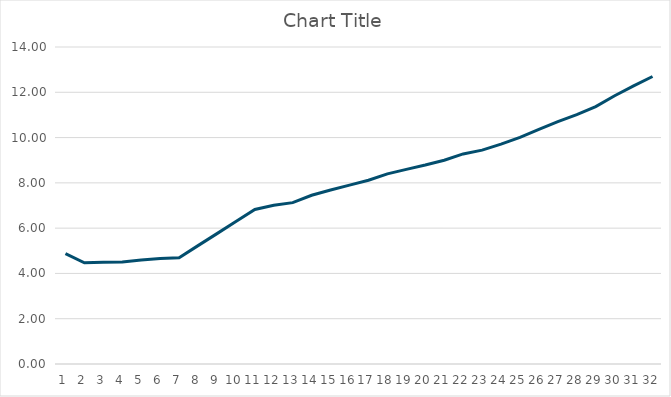
| Category | Series 0 |
|---|---|
| 0 | 4.876 |
| 1 | 4.467 |
| 2 | 4.495 |
| 3 | 4.508 |
| 4 | 4.597 |
| 5 | 4.664 |
| 6 | 4.697 |
| 7 | 5.227 |
| 8 | 5.758 |
| 9 | 6.29 |
| 10 | 6.822 |
| 11 | 7.007 |
| 12 | 7.127 |
| 13 | 7.452 |
| 14 | 7.683 |
| 15 | 7.899 |
| 16 | 8.118 |
| 17 | 8.396 |
| 18 | 8.596 |
| 19 | 8.786 |
| 20 | 8.998 |
| 21 | 9.278 |
| 22 | 9.445 |
| 23 | 9.709 |
| 24 | 10.012 |
| 25 | 10.358 |
| 26 | 10.701 |
| 27 | 11.015 |
| 28 | 11.37 |
| 29 | 11.849 |
| 30 | 12.281 |
| 31 | 12.697 |